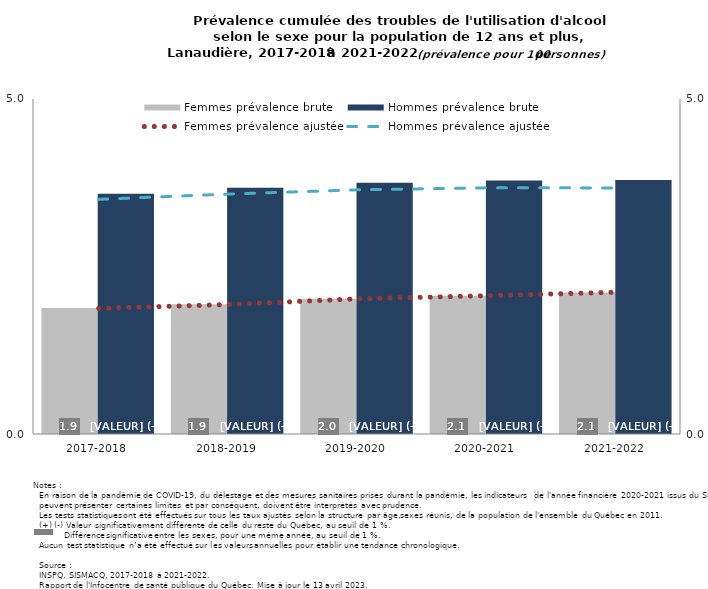
| Category | Femmes prévalence brute | Hommes prévalence brute |
|---|---|---|
| 2017-2018 | 1.88 | 3.586 |
| 2018-2019 | 1.936 | 3.676 |
| 2019-2020 | 2.018 | 3.75 |
| 2020-2021 | 2.063 | 3.785 |
| 2021-2022 | 2.11 | 3.79 |